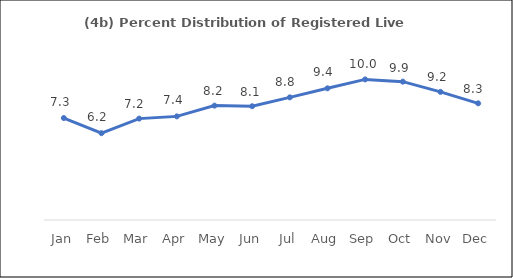
| Category | Series 0 |
|---|---|
| Jan | 7.284 |
| Feb | 6.201 |
| Mar | 7.242 |
| Apr | 7.402 |
| May | 8.17 |
| Jun | 8.126 |
| Jul | 8.762 |
| Aug | 9.405 |
| Sep | 10.043 |
| Oct | 9.881 |
| Nov | 9.151 |
| Dec | 8.334 |